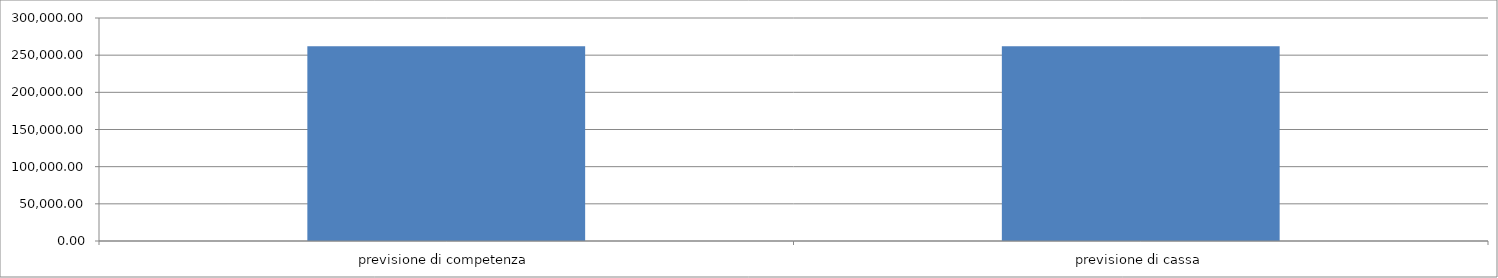
| Category | Series 0 |
|---|---|
| previsione di competenza | 262000 |
| previsione di cassa | 262000 |